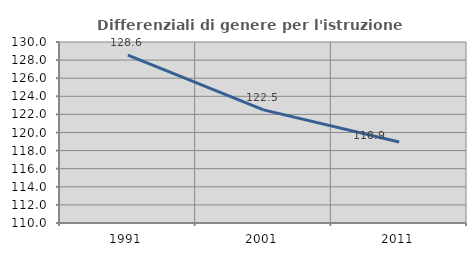
| Category | Differenziali di genere per l'istruzione superiore |
|---|---|
| 1991.0 | 128.561 |
| 2001.0 | 122.504 |
| 2011.0 | 118.949 |